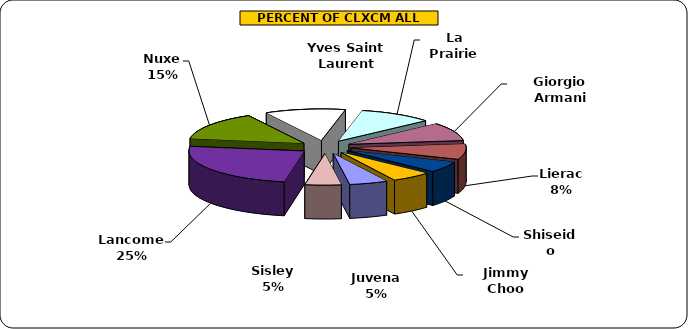
| Category | Series 0 |
|---|---|
| Lancome | 5966 |
| Nuxe | 3562 |
| Yves Saint Laurent | 2740 |
| La Prairie | 2506 |
| Giorgio Armani | 2281 |
| Lierac | 1918 |
| Shiseido | 1385 |
| Jimmy Choo | 1370 |
| Juvena | 1307 |
| Sisley | 1230 |